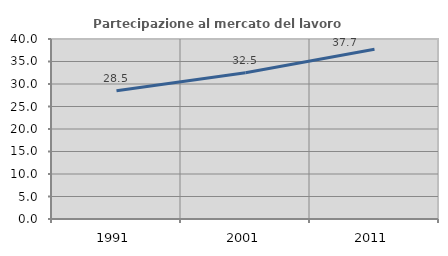
| Category | Partecipazione al mercato del lavoro  femminile |
|---|---|
| 1991.0 | 28.504 |
| 2001.0 | 32.519 |
| 2011.0 | 37.715 |